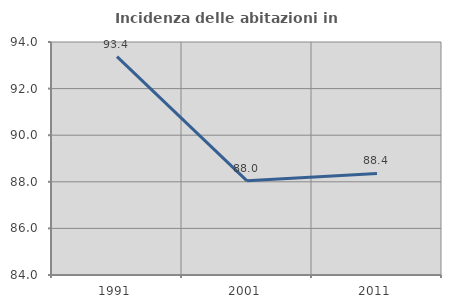
| Category | Incidenza delle abitazioni in proprietà  |
|---|---|
| 1991.0 | 93.372 |
| 2001.0 | 88.042 |
| 2011.0 | 88.361 |